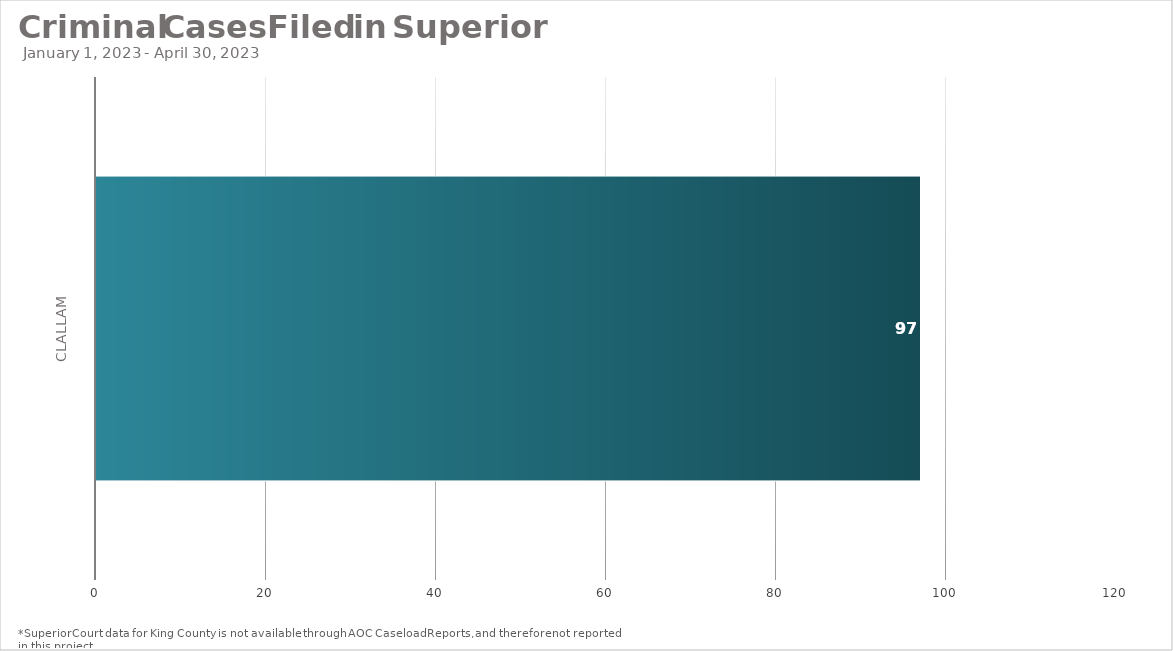
| Category | Total |
|---|---|
| Clallam | 97 |